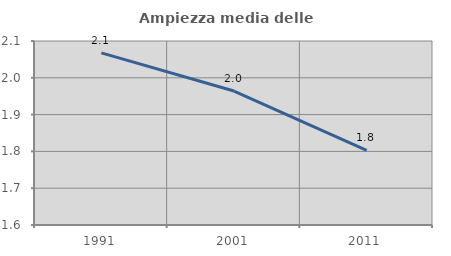
| Category | Ampiezza media delle famiglie |
|---|---|
| 1991.0 | 2.068 |
| 2001.0 | 1.964 |
| 2011.0 | 1.803 |